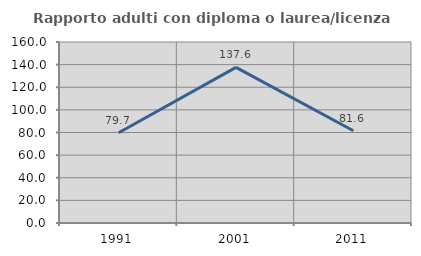
| Category | Rapporto adulti con diploma o laurea/licenza media  |
|---|---|
| 1991.0 | 79.73 |
| 2001.0 | 137.612 |
| 2011.0 | 81.594 |